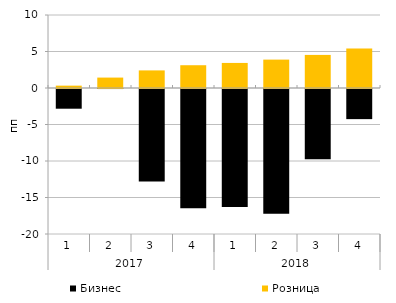
| Category | Бизнес | Розница |
|---|---|---|
| 0 | -2.699 | 0.323 |
| 1 | -0.005 | 1.427 |
| 2 | -12.657 | 2.409 |
| 3 | -16.343 | 3.119 |
| 4 | -16.169 | 3.434 |
| 5 | -17.094 | 3.889 |
| 6 | -9.631 | 4.532 |
| 7 | -4.127 | 5.395 |